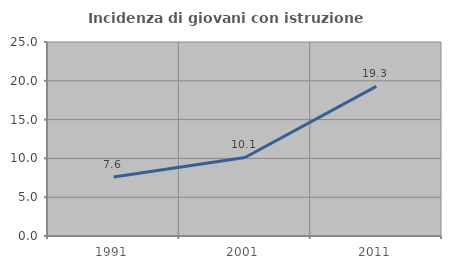
| Category | Incidenza di giovani con istruzione universitaria |
|---|---|
| 1991.0 | 7.616 |
| 2001.0 | 10.123 |
| 2011.0 | 19.277 |